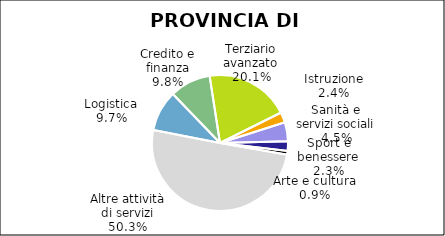
| Category | Provincia di Varese |
|---|---|
| Logistica | 2620 |
| Credito e finanza | 2625 |
| Terziario avanzato | 5403 |
| Istruzione | 657 |
| Sanità e servizi sociali | 1215 |
| Sport e benessere | 606 |
| Arte e cultura | 235 |
| Altre attività di servizi | 13531 |